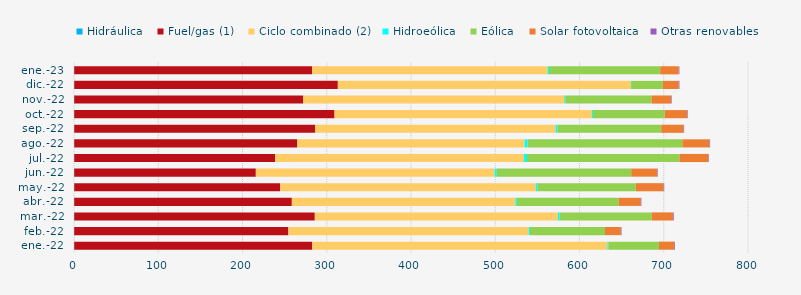
| Category | Hidráulica | Fuel/gas (1) | Ciclo combinado (2) | Hidroeólica | Eólica | Solar fotovoltaica | Otras renovables |
|---|---|---|---|---|---|---|---|
| ene.-22 | 0.294 | 282.53 | 350.332 | 1.111 | 60.126 | 18.057 | 0.861 |
| feb.-22 | 0.251 | 254.214 | 285.345 | 1.482 | 88.964 | 18.873 | 0.721 |
| mar.-22 | 0.296 | 285.515 | 288.521 | 2.126 | 109.415 | 25.048 | 0.91 |
| abr.-22 | 0.274 | 258.292 | 265.373 | 1.753 | 120.739 | 26.389 | 0.614 |
| may.-22 | 0.299 | 244.426 | 303.457 | 1.917 | 116.774 | 32.969 | 0.721 |
| jun.-22 | 0.281 | 215.547 | 283.584 | 2.45 | 159.505 | 30.724 | 0.696 |
| jul.-22 | 0.294 | 238.317 | 295.517 | 3.563 | 180.965 | 34.259 | 0.688 |
| ago.-22 | 0.293 | 264.803 | 269.791 | 3.518 | 183.708 | 32.217 | 0.715 |
| sep.-22 | 0.289 | 286.046 | 285.298 | 2.075 | 123.261 | 26.5 | 0.715 |
| oct.-22 | 0.294 | 308.951 | 305.386 | 1.35 | 85.114 | 26.618 | 0.731 |
| nov.-22 | 0.277 | 271.883 | 309.743 | 1.169 | 102.415 | 23.099 | 0.765 |
| dic.-22 | 0.289 | 312.877 | 347.662 | 0.367 | 37.762 | 18.863 | 0.785 |
| ene.-23 | 0.275 | 282.444 | 279.419 | 1.65 | 132 | 21.999 | 0.784 |